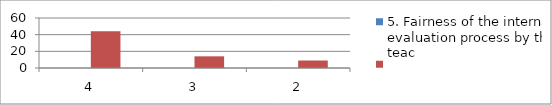
| Category | 5. Fairness of the internal evaluation process by the teac | Series 1 |
|---|---|---|
| 4.0 | 0 | 44 |
| 3.0 | 0 | 14 |
| 2.0 | 0 | 9 |